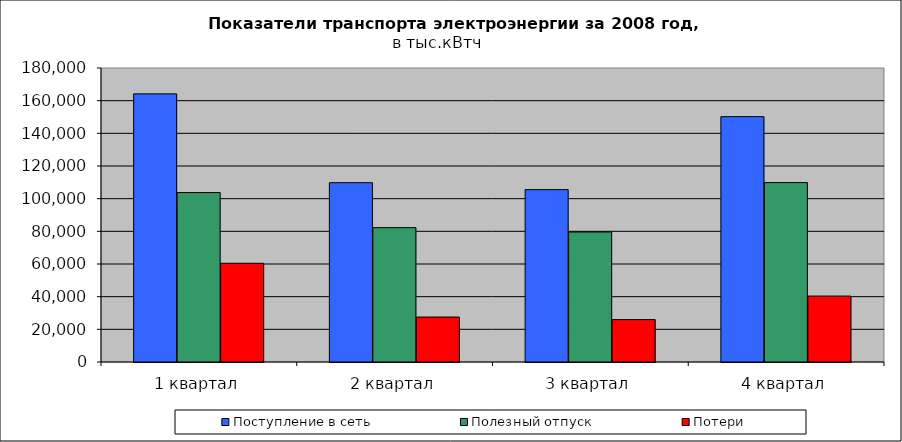
| Category | Поступление в сеть | Полезный отпуск | Потери |
|---|---|---|---|
| 1 квартал | 164158.822 | 103727.809 | 60431.013 |
| 2 квартал | 109778.807 | 82260.658 | 27518.149 |
| 3 квартал | 105537.247 | 79592.142 | 25945.105 |
| 4 квартал | 150215.382 | 109845.589 | 40369.793 |